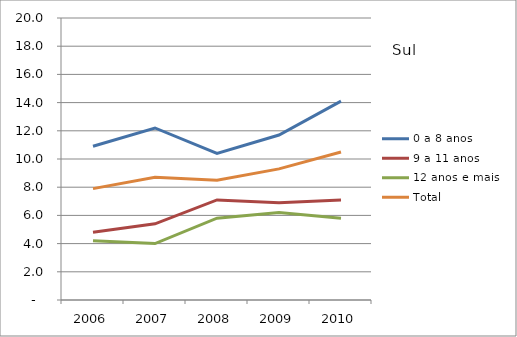
| Category | 0 a 8 anos | 9 a 11 anos | 12 anos e mais | Total |
|---|---|---|---|---|
| 2006.0 | 10.9 | 4.8 | 4.2 | 7.9 |
| 2007.0 | 12.2 | 5.4 | 4 | 8.7 |
| 2008.0 | 10.4 | 7.1 | 5.8 | 8.5 |
| 2009.0 | 11.7 | 6.9 | 6.2 | 9.3 |
| 2010.0 | 14.1 | 7.1 | 5.8 | 10.5 |